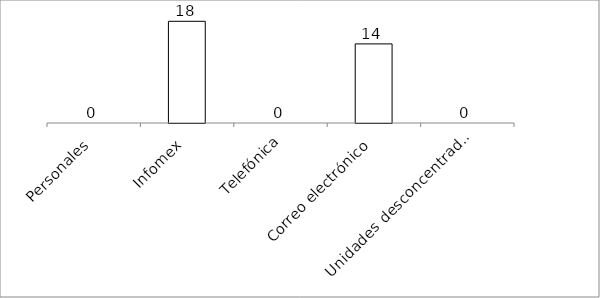
| Category | Series 0 |
|---|---|
| Personales | 0 |
| Infomex | 18 |
| Telefónica | 0 |
| Correo electrónico | 14 |
| Unidades desconcentradas | 0 |